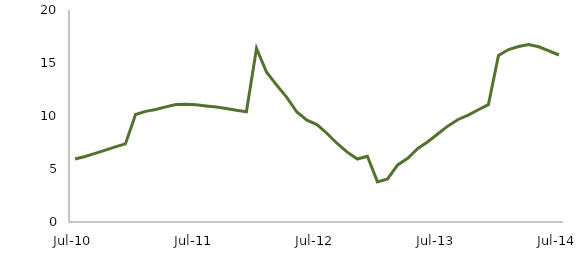
| Category | Series 0 |
|---|---|
| Jul-10 | 5.938 |
|  | 6.177 |
|  | 6.472 |
|  | 6.786 |
|  | 7.082 |
|  | 7.369 |
|  | 10.146 |
|  | 10.438 |
|  | 10.611 |
|  | 10.862 |
|  | 11.089 |
|  | 11.108 |
| Jul-11 | 11.056 |
|  | 10.952 |
|  | 10.857 |
|  | 10.717 |
|  | 10.538 |
|  | 10.395 |
|  | 16.386 |
|  | 14.123 |
|  | 12.918 |
|  | 11.755 |
|  | 10.374 |
|  | 9.606 |
| Jul-12 | 9.195 |
|  | 8.349 |
|  | 7.408 |
|  | 6.592 |
|  | 5.938 |
|  | 6.204 |
|  | 3.789 |
|  | 4.058 |
|  | 5.388 |
|  | 6.01 |
|  | 6.935 |
|  | 7.567 |
| Jul-13 | 8.326 |
|  | 9.065 |
|  | 9.672 |
|  | 10.081 |
|  | 10.588 |
|  | 11.067 |
|  | 15.71 |
|  | 16.267 |
|  | 16.561 |
|  | 16.745 |
|  | 16.528 |
|  | 16.143 |
| Jul-14 | 15.755 |